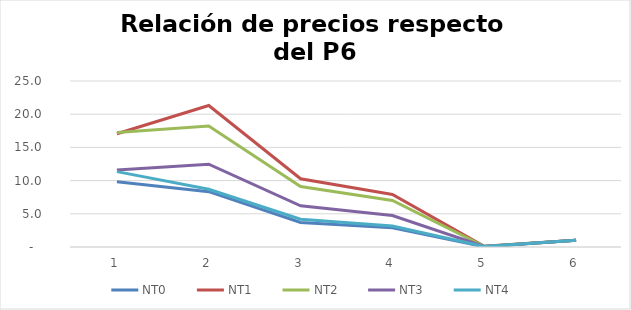
| Category | NT0 | NT1 | NT2 | NT3 | NT4 |
|---|---|---|---|---|---|
| 0 | 9.831 | 17.055 | 17.246 | 11.582 | 11.354 |
| 1 | 8.33 | 21.314 | 18.237 | 12.468 | 8.702 |
| 2 | 3.687 | 10.28 | 9.115 | 6.208 | 4.186 |
| 3 | 2.904 | 7.899 | 7.008 | 4.736 | 3.175 |
| 4 | 0.044 | 0.116 | 0.109 | 0.083 | 0.075 |
| 5 | 1 | 1 | 1 | 1 | 1 |